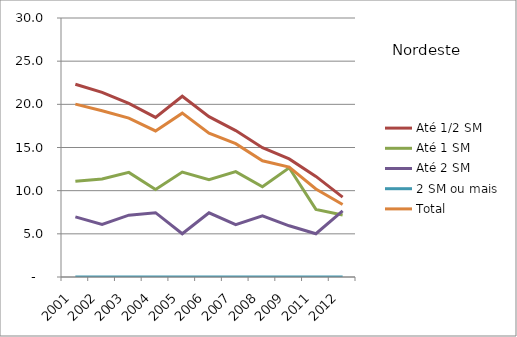
| Category | Até 1/2 SM | Até 1 SM | Até 2 SM | 2 SM ou mais | Total |
|---|---|---|---|---|---|
| 2001 | 22.33 | 11.08 | 6.96 | 0 | 20.02 |
| 2002 | 21.38 | 11.36 | 6.08 | 0 | 19.26 |
| 2003 | 20.1 | 12.12 | 7.16 | 0 | 18.4 |
| 2004 | 18.49 | 10.13 | 7.45 | 0 | 16.92 |
| 2005 | 20.94 | 12.15 | 5.01 | 0 | 18.98 |
| 2006 | 18.57 | 11.27 | 7.43 | 0 | 16.67 |
| 2007 | 16.96 | 12.21 | 6.07 | 0 | 15.45 |
| 2008 | 14.98 | 10.45 | 7.09 | 0 | 13.46 |
| 2009 | 13.68 | 12.65 | 5.93 | 0 | 12.74 |
| 2011 | 11.65 | 7.83 | 5.01 | 0 | 10.19 |
| 2012 | 9.25 | 7.19 | 7.66 | 0 | 8.4 |